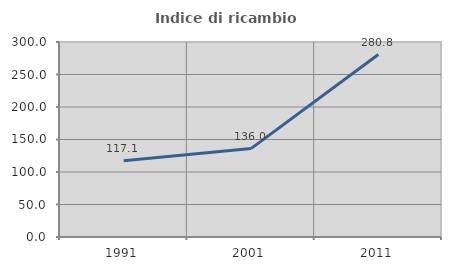
| Category | Indice di ricambio occupazionale  |
|---|---|
| 1991.0 | 117.143 |
| 2001.0 | 136 |
| 2011.0 | 280.769 |